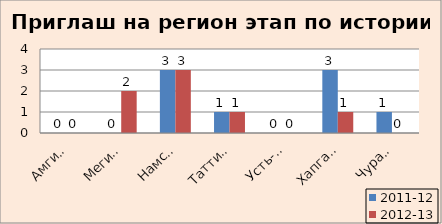
| Category | 2011-12 | 2012-13 |
|---|---|---|
| Амгинский | 0 | 0 |
| Мегино-Кангаласс | 0 | 2 |
| Намский | 3 | 3 |
| Таттинский | 1 | 1 |
| Усть-Алданский | 0 | 0 |
| Хапгаласский | 3 | 1 |
| Чурапчинский | 1 | 0 |